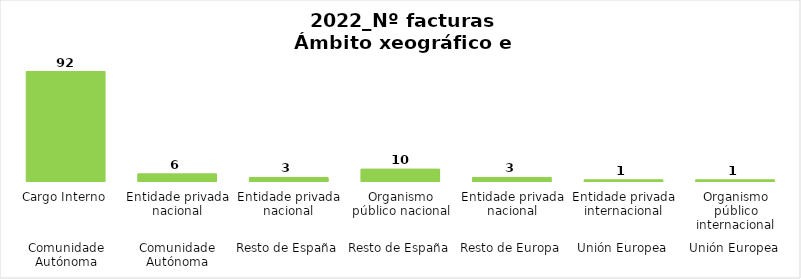
| Category | Series 0 |
|---|---|
| 0 | 92 |
| 1 | 6 |
| 2 | 3 |
| 3 | 10 |
| 4 | 3 |
| 5 | 1 |
| 6 | 1 |